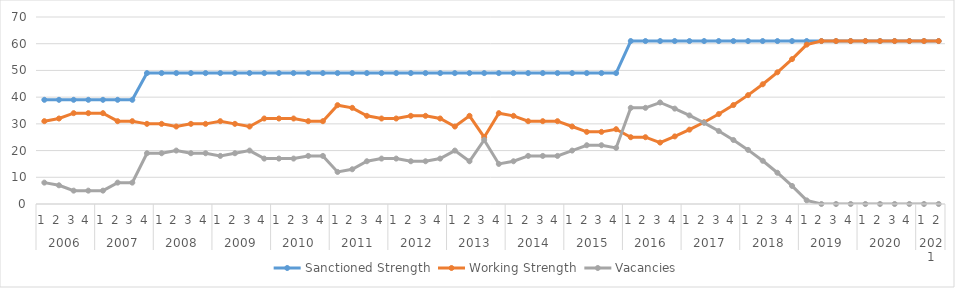
| Category | Sanctioned Strength | Working Strength | Vacancies |
|---|---|---|---|
| 0 | 39 | 31 | 8 |
| 1 | 39 | 32 | 7 |
| 2 | 39 | 34 | 5 |
| 3 | 39 | 34 | 5 |
| 4 | 39 | 34 | 5 |
| 5 | 39 | 31 | 8 |
| 6 | 39 | 31 | 8 |
| 7 | 49 | 30 | 19 |
| 8 | 49 | 30 | 19 |
| 9 | 49 | 29 | 20 |
| 10 | 49 | 30 | 19 |
| 11 | 49 | 30 | 19 |
| 12 | 49 | 31 | 18 |
| 13 | 49 | 30 | 19 |
| 14 | 49 | 29 | 20 |
| 15 | 49 | 32 | 17 |
| 16 | 49 | 32 | 17 |
| 17 | 49 | 32 | 17 |
| 18 | 49 | 31 | 18 |
| 19 | 49 | 31 | 18 |
| 20 | 49 | 37 | 12 |
| 21 | 49 | 36 | 13 |
| 22 | 49 | 33 | 16 |
| 23 | 49 | 32 | 17 |
| 24 | 49 | 32 | 17 |
| 25 | 49 | 33 | 16 |
| 26 | 49 | 33 | 16 |
| 27 | 49 | 32 | 17 |
| 28 | 49 | 29 | 20 |
| 29 | 49 | 33 | 16 |
| 30 | 49 | 25 | 24 |
| 31 | 49 | 34 | 15 |
| 32 | 49 | 33 | 16 |
| 33 | 49 | 31 | 18 |
| 34 | 49 | 31 | 18 |
| 35 | 49 | 31 | 18 |
| 36 | 49 | 29 | 20 |
| 37 | 49 | 27 | 22 |
| 38 | 49 | 27 | 22 |
| 39 | 49 | 28 | 21 |
| 40 | 61 | 25 | 36 |
| 41 | 61 | 25 | 36 |
| 42 | 61 | 23 | 38 |
| 43 | 61 | 25.3 | 35.7 |
| 44 | 61 | 27.83 | 33.17 |
| 45 | 61 | 30.613 | 30.387 |
| 46 | 61 | 33.674 | 27.326 |
| 47 | 61 | 37.042 | 23.958 |
| 48 | 61 | 40.746 | 20.254 |
| 49 | 61 | 44.82 | 16.18 |
| 50 | 61 | 49.303 | 11.697 |
| 51 | 61 | 54.233 | 6.767 |
| 52 | 61 | 59.656 | 1.344 |
| 53 | 61 | 61 | 0 |
| 54 | 61 | 61 | 0 |
| 55 | 61 | 61 | 0 |
| 56 | 61 | 61 | 0 |
| 57 | 61 | 61 | 0 |
| 58 | 61 | 61 | 0 |
| 59 | 61 | 61 | 0 |
| 60 | 61 | 61 | 0 |
| 61 | 61 | 61 | 0 |